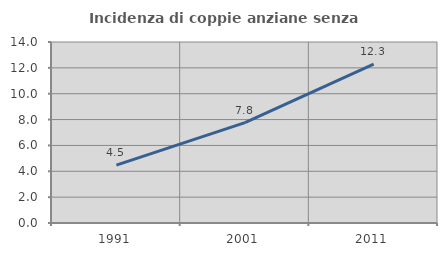
| Category | Incidenza di coppie anziane senza figli  |
|---|---|
| 1991.0 | 4.479 |
| 2001.0 | 7.766 |
| 2011.0 | 12.287 |